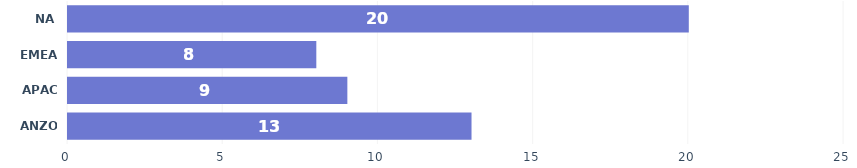
| Category | Total |
|---|---|
| 0 | 13 |
| 1 | 9 |
| 2 | 8 |
| 3 | 20 |